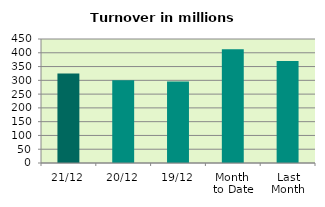
| Category | Series 0 |
|---|---|
| 21/12 | 324.483 |
| 20/12 | 300.636 |
| 19/12 | 296.038 |
| Month 
to Date | 412.958 |
| Last
Month | 369.747 |